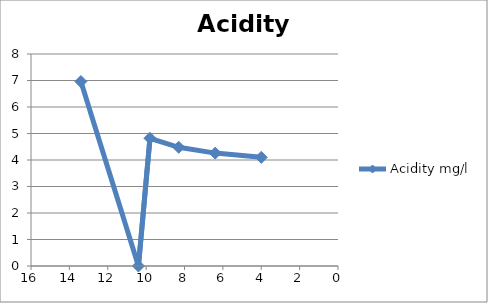
| Category | Acidity mg/l |
|---|---|
| 13.4 | 6.96 |
| 10.4 | 0 |
| 9.8 | 4.82 |
| 8.3 | 4.48 |
| 6.4 | 4.26 |
| 4.0 | 4.1 |